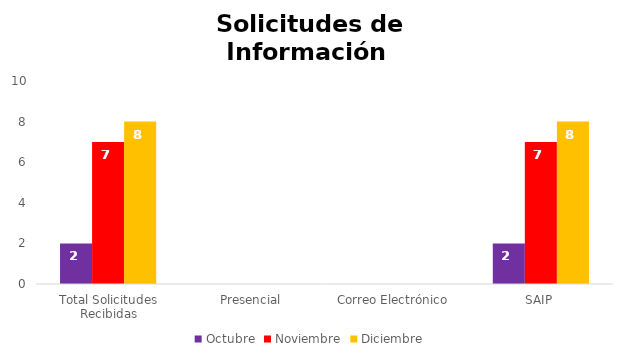
| Category | Octubre | Noviembre | Diciembre |
|---|---|---|---|
| Total Solicitudes Recibidas | 2 | 7 | 8 |
| Presencial | 0 | 0 | 0 |
| Correo Electrónico  | 0 | 0 | 0 |
| SAIP | 2 | 7 | 8 |